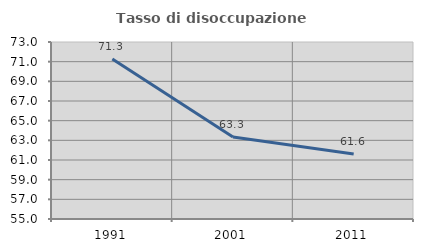
| Category | Tasso di disoccupazione giovanile  |
|---|---|
| 1991.0 | 71.277 |
| 2001.0 | 63.333 |
| 2011.0 | 61.6 |